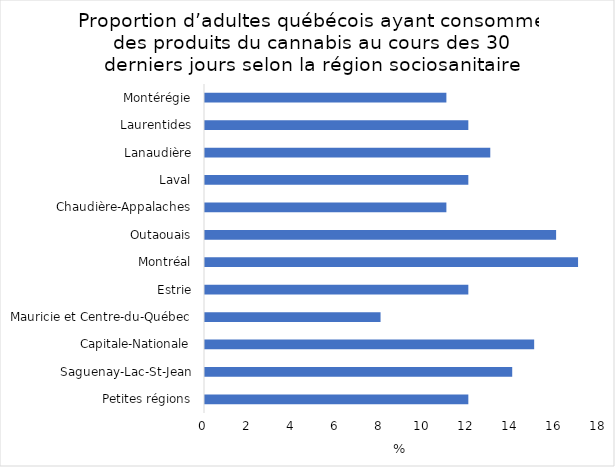
| Category | Series 0 |
|---|---|
| Petites régions | 12 |
| Saguenay-Lac-St-Jean | 14 |
| Capitale-Nationale | 15 |
| Mauricie et Centre-du-Québec | 8 |
| Estrie | 12 |
| Montréal | 17 |
| Outaouais | 16 |
| Chaudière-Appalaches | 11 |
| Laval | 12 |
| Lanaudière | 13 |
| Laurentides | 12 |
| Montérégie | 11 |